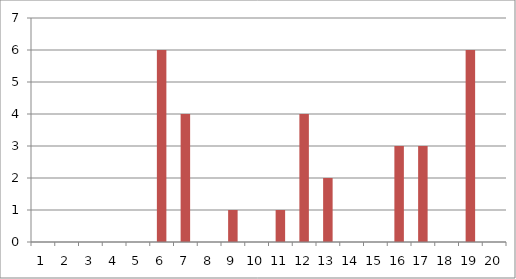
| Category | Series 0 |
|---|---|
| 0 | 0 |
| 1 | 0 |
| 2 | 0 |
| 3 | 0 |
| 4 | 0 |
| 5 | 6 |
| 6 | 4 |
| 7 | 0 |
| 8 | 1 |
| 9 | 0 |
| 10 | 1 |
| 11 | 4 |
| 12 | 2 |
| 13 | 0 |
| 14 | 0 |
| 15 | 3 |
| 16 | 3 |
| 17 | 0 |
| 18 | 6 |
| 19 | 0 |